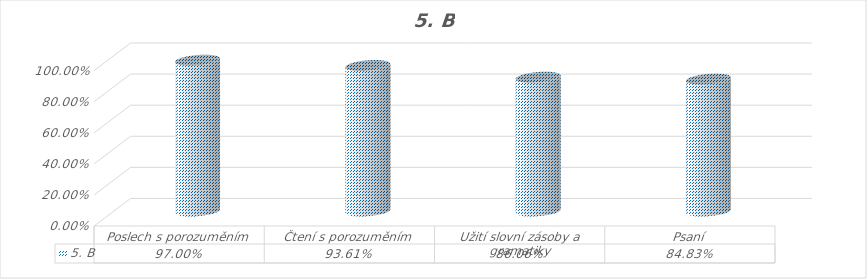
| Category | 5. B |
|---|---|
| Poslech s porozuměním | 0.97 |
| Čtení s porozuměním | 0.936 |
| Užití slovní zásoby a gramatiky | 0.861 |
| Psaní | 0.848 |